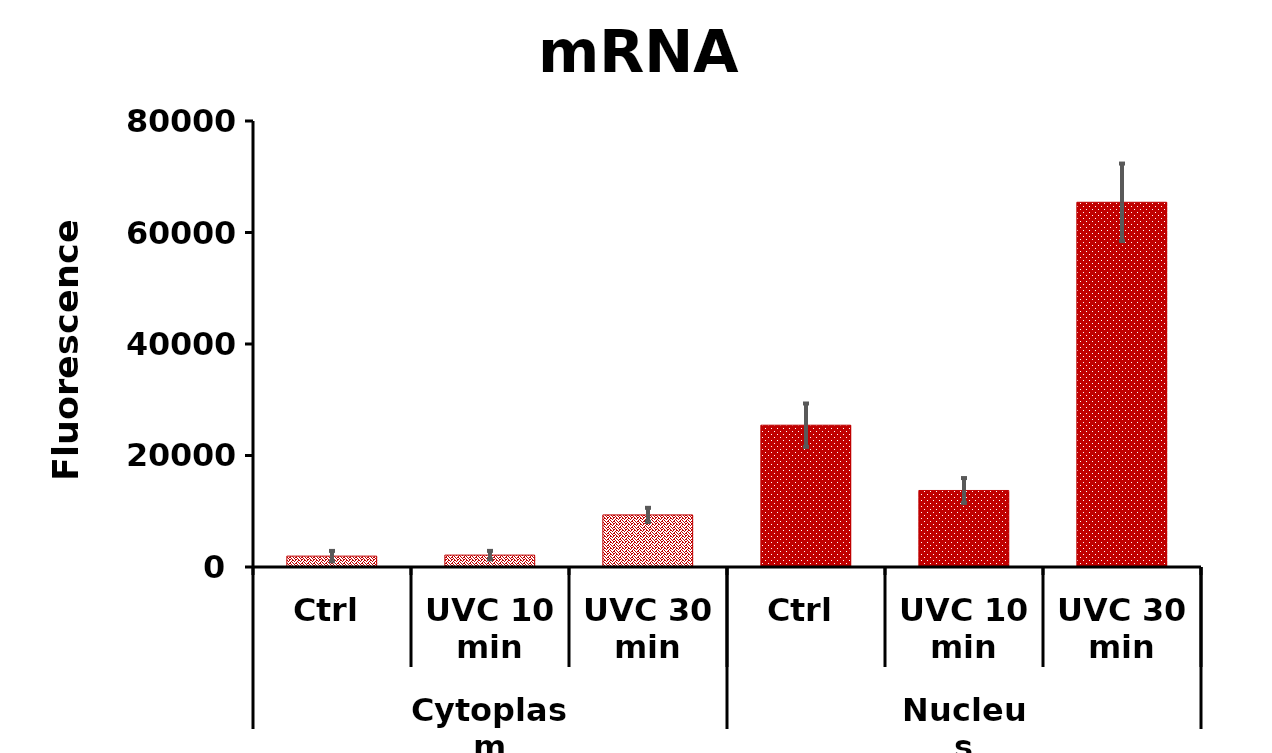
| Category | Series 0 |
|---|---|
| 0 | 1949.778 |
| 1 | 2132.511 |
| 2 | 9344.067 |
| 3 | 25435.511 |
| 4 | 13725.133 |
| 5 | 65420.511 |